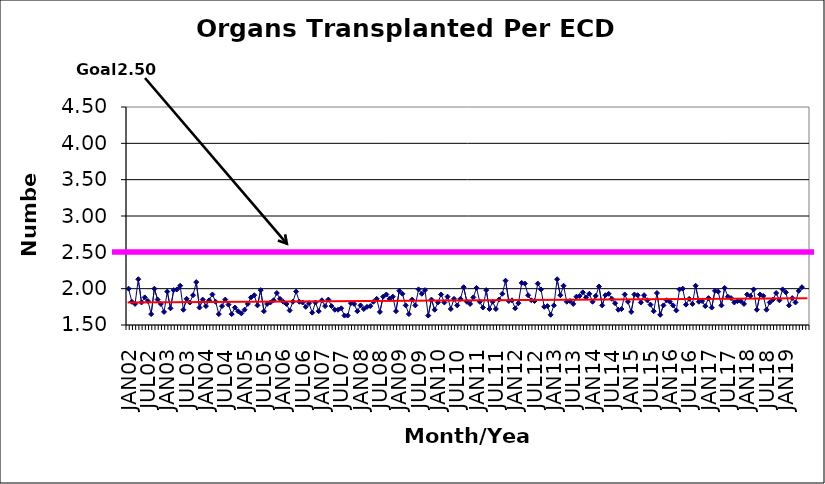
| Category | Series 0 |
|---|---|
| JAN02 | 2 |
| FEB02 | 1.82 |
| MAR02 | 1.79 |
| APR02 | 2.13 |
| MAY02 | 1.81 |
| JUN02 | 1.88 |
| JUL02 | 1.83 |
| AUG02 | 1.65 |
| SEP02 | 2 |
| OCT02 | 1.85 |
| NOV02 | 1.79 |
| DEC02 | 1.68 |
| JAN03 | 1.96 |
| FEB03 | 1.73 |
| MAR03 | 1.98 |
| APR03 | 1.99 |
| MAY03 | 2.04 |
| JUN03 | 1.71 |
| JUL03 | 1.86 |
| AUG03 | 1.81 |
| SEP03 | 1.91 |
| OCT03 | 2.09 |
| NOV03 | 1.74 |
| DEC03 | 1.85 |
| JAN04 | 1.76 |
| FEB04 | 1.84 |
| MAR04 | 1.92 |
| APR04 | 1.82 |
| MAY04 | 1.65 |
| JUN04 | 1.76 |
| JUL04 | 1.85 |
| AUG04 | 1.78 |
| SEP04 | 1.65 |
| OCT04 | 1.74 |
| NOV04 | 1.69 |
| DEC04 | 1.66 |
| JAN05 | 1.71 |
| FEB05 | 1.79 |
| MAR05 | 1.88 |
| APR05 | 1.91 |
| MAY05 | 1.77 |
| JUN05 | 1.98 |
| JUL05 | 1.69 |
| AUG05 | 1.79 |
| SEP05 | 1.81 |
| OCT05 | 1.84 |
| NOV05 | 1.94 |
| DEC05 | 1.86 |
| JAN06 | 1.82 |
| FEB06 | 1.79 |
| MAR06 | 1.7 |
| APR06 | 1.82 |
| MAY06 | 1.96 |
| JUN06 | 1.82 |
| JUL06 | 1.81 |
| AUG06 | 1.75 |
| SEP06 | 1.8 |
| OCT06 | 1.67 |
| NOV06 | 1.81 |
| DEC06 | 1.69 |
| JAN07 | 1.84 |
| FEB07 | 1.76 |
| MAR07 | 1.85 |
| APR07 | 1.76 |
| MAY07 | 1.71 |
| JUN07 | 1.71 |
| JUL07 | 1.73 |
| AUG07 | 1.63 |
| SEP07 | 1.63 |
| OCT07 | 1.8 |
| NOV07 | 1.79 |
| DEC07 | 1.69 |
| JAN08 | 1.77 |
| FEB08 | 1.72 |
| MAR08 | 1.75 |
| APR08 | 1.76 |
| MAY08 | 1.82 |
| JUN08 | 1.86 |
| JUL08 | 1.68 |
| AUG08 | 1.89 |
| SEP08 | 1.92 |
| OCT08 | 1.86 |
| NOV08 | 1.89 |
| DEC08 | 1.69 |
| JAN09 | 1.97 |
| FEB09 | 1.93 |
| MAR09 | 1.77 |
| APR09 | 1.65 |
| MAY09 | 1.85 |
| JUN09 | 1.77 |
| JUL09 | 1.99 |
| AUG09 | 1.93 |
| SEP09 | 1.98 |
| OCT09 | 1.63 |
| NOV09 | 1.85 |
| DEC09 | 1.71 |
| JAN10 | 1.81 |
| FEB10 | 1.92 |
| MAR10 | 1.81 |
| APR10 | 1.89 |
| MAY10 | 1.72 |
| JUN10 | 1.86 |
| JUL10 | 1.77 |
| AUG10 | 1.86 |
| SEP10 | 2.02 |
| OCT10 | 1.82 |
| NOV10 | 1.79 |
| DEC10 | 1.88 |
| JAN11 | 2.01 |
| FEB11 | 1.82 |
| MAR11 | 1.74 |
| APR11 | 1.98 |
| MAY11 | 1.72 |
| JUN11 | 1.82 |
| JUL11 | 1.72 |
| AUG11 | 1.85 |
| SEP11 | 1.93 |
| OCT11 | 2.11 |
| NOV11 | 1.83 |
| DEC11 | 1.84 |
| JAN12 | 1.73 |
| FEB12 | 1.8 |
| MAR12 | 2.08 |
| APR12 | 2.07 |
| MAY12 | 1.91 |
| JUN12 | 1.84 |
| JUL12 | 1.83 |
| AUG12 | 2.07 |
| SEP12 | 1.99 |
| OCT12 | 1.75 |
| NOV12 | 1.76 |
| DEC12 | 1.64 |
| JAN13 | 1.77 |
| FEB13 | 2.13 |
| MAR13 | 1.91 |
| APR13 | 2.04 |
| MAY13 | 1.82 |
| JUN13 | 1.83 |
| JUL13 | 1.79 |
| AUG13 | 1.89 |
| SEP13 | 1.9 |
| OCT13 | 1.95 |
| NOV13 | 1.88 |
| DEC13 | 1.93 |
| JAN14 | 1.82 |
| FEB14 | 1.9 |
| MAR14 | 2.03 |
| APR14 | 1.77 |
| MAY14 | 1.91 |
| JUN14 | 1.93 |
| JUL14 | 1.86 |
| AUG14 | 1.8 |
| SEP14 | 1.71 |
| OCT14 | 1.72 |
| NOV14 | 1.92 |
| DEC14 | 1.82 |
| JAN15 | 1.68 |
| FEB15 | 1.92 |
| MAR15 | 1.91 |
| APR15 | 1.81 |
| MAY15 | 1.91 |
| JUN15 | 1.84 |
| JUL15 | 1.78 |
| AUG15 | 1.69 |
| SEP15 | 1.94 |
| OCT15 | 1.64 |
| NOV15 | 1.77 |
| DEC15 | 1.84 |
| JAN16 | 1.82 |
| FEB16 | 1.77 |
| MAR16 | 1.7 |
| APR16 | 1.99 |
| MAY16 | 2 |
| JUN16 | 1.78 |
| JUL16 | 1.86 |
| AUG16 | 1.79 |
| SEP16 | 2.04 |
| OCT16 | 1.82 |
| NOV16 | 1.83 |
| DEC16 | 1.76 |
| JAN17 | 1.87 |
| FEB17 | 1.74 |
| MAR17 | 1.97 |
| APR17 | 1.96 |
| MAY17 | 1.77 |
| JUN17 | 2.01 |
| JUL17 | 1.89 |
| AUG17 | 1.87 |
| SEP17 | 1.81 |
| OCT17 | 1.83 |
| NOV17 | 1.83 |
| DEC17 | 1.79 |
| JAN18 | 1.92 |
| FEB18 | 1.9 |
| MAR18 | 1.99 |
| APR18 | 1.71 |
| MAY18 | 1.92 |
| JUN18 | 1.9 |
| JUL18 | 1.71 |
| AUG18 | 1.81 |
| SEP18 | 1.85 |
| OCT18 | 1.94 |
| NOV18 | 1.84 |
| DEC18 | 1.99 |
| JAN19 | 1.95 |
| FEB19 | 1.77 |
| MAR19 | 1.87 |
| APR19 | 1.81 |
| MAY19 | 1.97 |
| JUN19 | 2.02 |